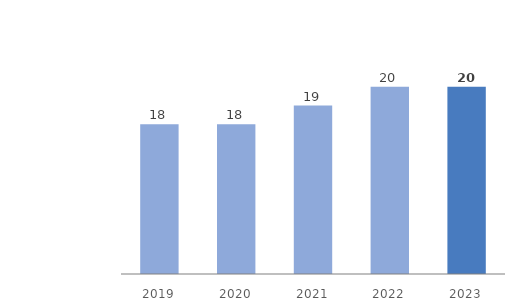
| Category | Assets in Kazakhstan |
|---|---|
| 2019.0 | 18 |
| 2020.0 | 18 |
| 2021.0 | 19 |
| 2022.0 | 20 |
| 2023.0 | 20 |